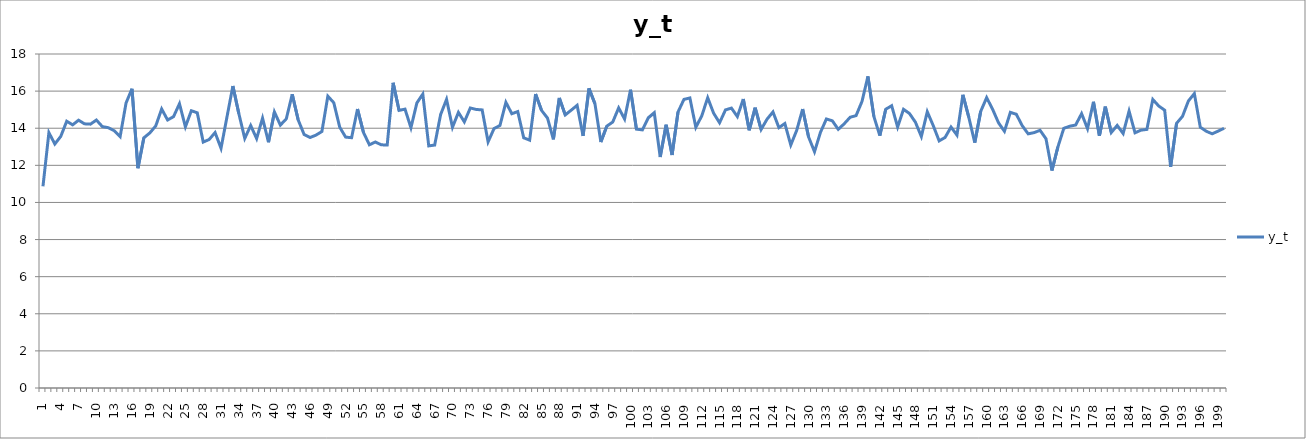
| Category | y_t |
|---|---|
| 1.0 | 10.869 |
| 2.0 | 13.761 |
| 3.0 | 13.15 |
| 4.0 | 13.561 |
| 5.0 | 14.377 |
| 6.0 | 14.182 |
| 7.0 | 14.432 |
| 8.0 | 14.237 |
| 9.0 | 14.219 |
| 10.0 | 14.441 |
| 11.0 | 14.089 |
| 12.0 | 14.029 |
| 13.0 | 13.865 |
| 14.0 | 13.544 |
| 15.0 | 15.36 |
| 16.0 | 16.127 |
| 17.0 | 11.844 |
| 18.0 | 13.484 |
| 19.0 | 13.746 |
| 20.0 | 14.122 |
| 21.0 | 15.037 |
| 22.0 | 14.442 |
| 23.0 | 14.624 |
| 24.0 | 15.319 |
| 25.0 | 14.074 |
| 26.0 | 14.943 |
| 27.0 | 14.832 |
| 28.0 | 13.253 |
| 29.0 | 13.392 |
| 30.0 | 13.766 |
| 31.0 | 12.92 |
| 32.0 | 14.602 |
| 33.0 | 16.274 |
| 34.0 | 14.791 |
| 35.0 | 13.451 |
| 36.0 | 14.146 |
| 37.0 | 13.441 |
| 38.0 | 14.544 |
| 39.0 | 13.245 |
| 40.0 | 14.875 |
| 41.0 | 14.167 |
| 42.0 | 14.507 |
| 43.0 | 15.831 |
| 44.0 | 14.451 |
| 45.0 | 13.663 |
| 46.0 | 13.499 |
| 47.0 | 13.628 |
| 48.0 | 13.824 |
| 49.0 | 15.726 |
| 50.0 | 15.374 |
| 51.0 | 14.056 |
| 52.0 | 13.52 |
| 53.0 | 13.489 |
| 54.0 | 15.035 |
| 55.0 | 13.774 |
| 56.0 | 13.107 |
| 57.0 | 13.258 |
| 58.0 | 13.105 |
| 59.0 | 13.096 |
| 60.0 | 16.448 |
| 61.0 | 14.961 |
| 62.0 | 15.029 |
| 63.0 | 14.027 |
| 64.0 | 15.363 |
| 65.0 | 15.841 |
| 66.0 | 13.047 |
| 67.0 | 13.094 |
| 68.0 | 14.735 |
| 69.0 | 15.554 |
| 70.0 | 14.049 |
| 71.0 | 14.854 |
| 72.0 | 14.342 |
| 73.0 | 15.091 |
| 74.0 | 15.011 |
| 75.0 | 14.987 |
| 76.0 | 13.264 |
| 77.0 | 13.98 |
| 78.0 | 14.149 |
| 79.0 | 15.396 |
| 80.0 | 14.782 |
| 81.0 | 14.898 |
| 82.0 | 13.484 |
| 83.0 | 13.357 |
| 84.0 | 15.844 |
| 85.0 | 14.966 |
| 86.0 | 14.553 |
| 87.0 | 13.398 |
| 88.0 | 15.633 |
| 89.0 | 14.717 |
| 90.0 | 14.971 |
| 91.0 | 15.234 |
| 92.0 | 13.585 |
| 93.0 | 16.148 |
| 94.0 | 15.325 |
| 95.0 | 13.256 |
| 96.0 | 14.11 |
| 97.0 | 14.333 |
| 98.0 | 15.096 |
| 99.0 | 14.496 |
| 100.0 | 16.076 |
| 101.0 | 13.946 |
| 102.0 | 13.914 |
| 103.0 | 14.562 |
| 104.0 | 14.834 |
| 105.0 | 12.453 |
| 106.0 | 14.183 |
| 107.0 | 12.559 |
| 108.0 | 14.871 |
| 109.0 | 15.554 |
| 110.0 | 15.63 |
| 111.0 | 14.048 |
| 112.0 | 14.663 |
| 113.0 | 15.642 |
| 114.0 | 14.809 |
| 115.0 | 14.294 |
| 116.0 | 14.987 |
| 117.0 | 15.085 |
| 118.0 | 14.627 |
| 119.0 | 15.571 |
| 120.0 | 13.889 |
| 121.0 | 15.106 |
| 122.0 | 13.932 |
| 123.0 | 14.487 |
| 124.0 | 14.878 |
| 125.0 | 14.03 |
| 126.0 | 14.254 |
| 127.0 | 13.096 |
| 128.0 | 13.887 |
| 129.0 | 15.033 |
| 130.0 | 13.529 |
| 131.0 | 12.733 |
| 132.0 | 13.778 |
| 133.0 | 14.498 |
| 134.0 | 14.401 |
| 135.0 | 13.939 |
| 136.0 | 14.238 |
| 137.0 | 14.591 |
| 138.0 | 14.679 |
| 139.0 | 15.444 |
| 140.0 | 16.795 |
| 141.0 | 14.638 |
| 142.0 | 13.599 |
| 143.0 | 15.023 |
| 144.0 | 15.212 |
| 145.0 | 14.065 |
| 146.0 | 15.019 |
| 147.0 | 14.793 |
| 148.0 | 14.325 |
| 149.0 | 13.553 |
| 150.0 | 14.889 |
| 151.0 | 14.143 |
| 152.0 | 13.318 |
| 153.0 | 13.502 |
| 154.0 | 14.064 |
| 155.0 | 13.629 |
| 156.0 | 15.803 |
| 157.0 | 14.589 |
| 158.0 | 13.225 |
| 159.0 | 14.907 |
| 160.0 | 15.649 |
| 161.0 | 15.026 |
| 162.0 | 14.294 |
| 163.0 | 13.835 |
| 164.0 | 14.856 |
| 165.0 | 14.753 |
| 166.0 | 14.134 |
| 167.0 | 13.697 |
| 168.0 | 13.763 |
| 169.0 | 13.888 |
| 170.0 | 13.434 |
| 171.0 | 11.719 |
| 172.0 | 12.984 |
| 173.0 | 13.994 |
| 174.0 | 14.108 |
| 175.0 | 14.174 |
| 176.0 | 14.786 |
| 177.0 | 13.978 |
| 178.0 | 15.421 |
| 179.0 | 13.589 |
| 180.0 | 15.164 |
| 181.0 | 13.768 |
| 182.0 | 14.151 |
| 183.0 | 13.715 |
| 184.0 | 14.924 |
| 185.0 | 13.754 |
| 186.0 | 13.895 |
| 187.0 | 13.936 |
| 188.0 | 15.549 |
| 189.0 | 15.197 |
| 190.0 | 14.972 |
| 191.0 | 11.915 |
| 192.0 | 14.263 |
| 193.0 | 14.639 |
| 194.0 | 15.471 |
| 195.0 | 15.867 |
| 196.0 | 14.055 |
| 197.0 | 13.838 |
| 198.0 | 13.7 |
| 199.0 | 13.843 |
| 200.0 | 13.997 |